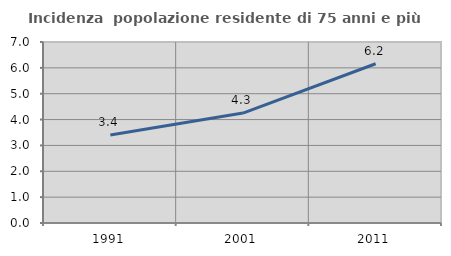
| Category | Incidenza  popolazione residente di 75 anni e più |
|---|---|
| 1991.0 | 3.401 |
| 2001.0 | 4.25 |
| 2011.0 | 6.159 |